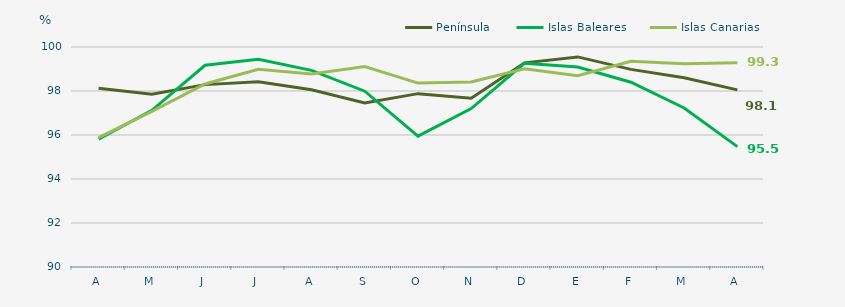
| Category | Península | Islas Baleares | Islas Canarias |
|---|---|---|---|
| A | 98.12 | 95.81 | 95.88 |
| M | 97.85 | 97.12 | 97.07 |
| J | 98.29 | 99.17 | 98.32 |
| J | 98.42 | 99.44 | 98.99 |
| A | 98.06 | 98.94 | 98.77 |
| S | 97.46 | 97.99 | 99.11 |
| O | 97.88 | 95.95 | 98.36 |
| N | 97.67 | 97.2 | 98.41 |
| D | 99.28 | 99.26 | 99.01 |
| E | 99.55 | 99.09 | 98.69 |
| F | 98.984 | 98.4 | 99.35 |
| M | 98.6 | 97.23 | 99.24 |
| A | 98.05 | 95.47 | 99.28 |